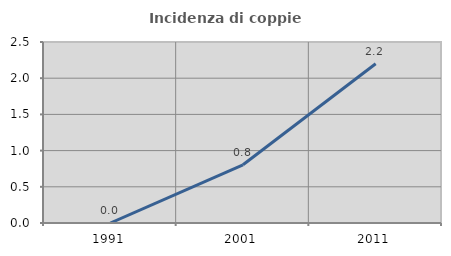
| Category | Incidenza di coppie miste |
|---|---|
| 1991.0 | 0 |
| 2001.0 | 0.804 |
| 2011.0 | 2.199 |